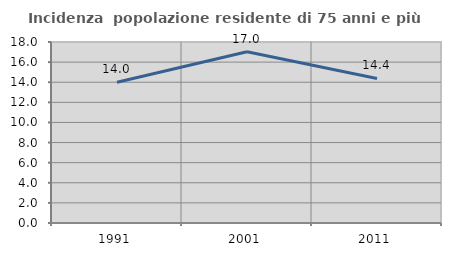
| Category | Incidenza  popolazione residente di 75 anni e più |
|---|---|
| 1991.0 | 14 |
| 2001.0 | 17.037 |
| 2011.0 | 14.375 |